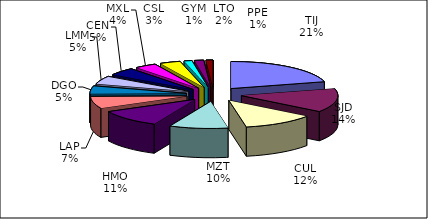
| Category | Series 0 |
|---|---|
| TIJ | 57382 |
| SJD | 38698 |
| CUL | 33103 |
| MZT | 26900 |
| HMO | 29311 |
| LAP | 19664 |
| DGO | 12857 |
| LMM | 13251 |
| CEN | 12638 |
| MXL | 9951 |
| CSL | 9475 |
| GYM | 3635 |
| LTO | 4241 |
| PPE | 3175 |